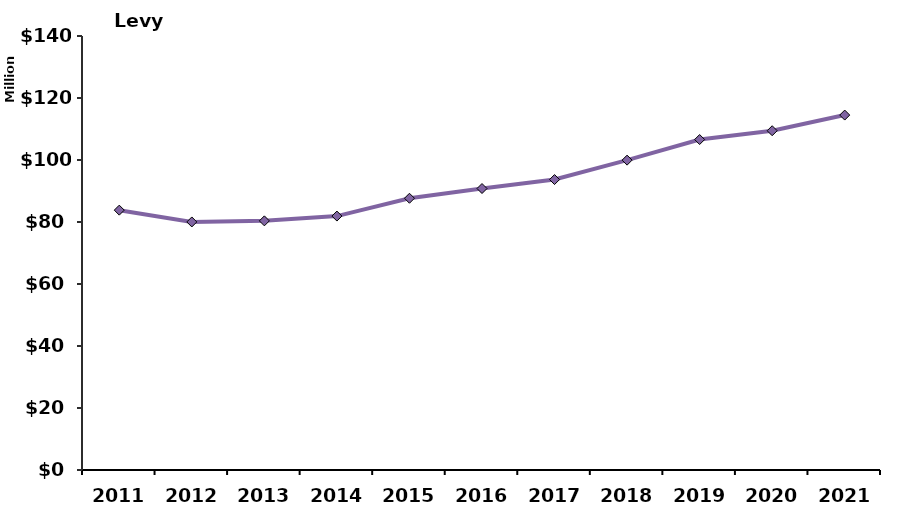
| Category | Levy Ceiling |
|---|---|
| 2011.0 | 83822080 |
| 2012.0 | 80015883 |
| 2013.0 | 80366692 |
| 2014.0 | 81913441 |
| 2015.0 | 87660517 |
| 2016.0 | 90798118 |
| 2017.0 | 93692696 |
| 2018.0 | 99950449 |
| 2019.0 | 106602127 |
| 2020.0 | 109441421 |
| 2021.0 | 114494462 |